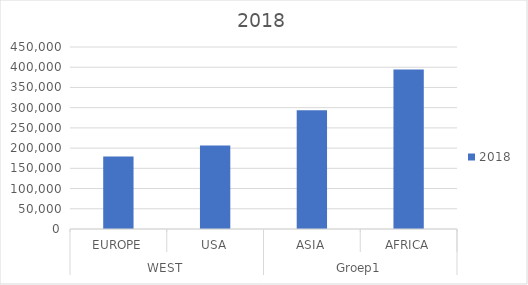
| Category | 2018 |
|---|---|
| 0 | 179005 |
| 1 | 206572 |
| 2 | 293456 |
| 3 | 394520 |